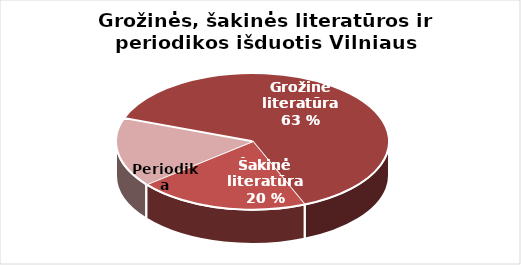
| Category | Series 0 |
|---|---|
| Grožinė literatūra | 1041732 |
| Šakinė literatūra | 336077 |
| Periodika | 270189 |